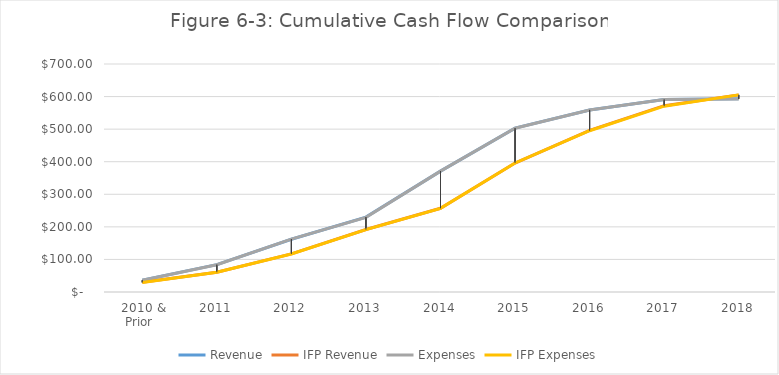
| Category | Revenue | IFP Revenue | Expenses | IFP Expenses |
|---|---|---|---|---|
| 2010 & Prior | 36 | 30 | 35.8 | 29.4 |
| 2011 | 84 | 60.7 | 83.6 | 60.7 |
| 2012 | 162 | 117 | 162.3 | 116.8 |
| 2013 | 230 | 192 | 229.2 | 191.4 |
| 2014 | 371 | 257 | 371 | 256.8 |
| 2015 | 503 | 396 | 502.7 | 396.1 |
| 2016 | 559 | 496 | 558.9 | 495.2 |
| 2017 | 591 | 572 | 590.8 | 570.5 |
| 2018 | 593 | 605.2 | 592.9 | 605.2 |